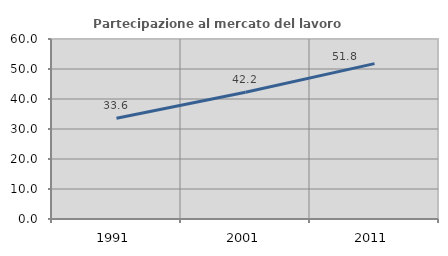
| Category | Partecipazione al mercato del lavoro  femminile |
|---|---|
| 1991.0 | 33.579 |
| 2001.0 | 42.238 |
| 2011.0 | 51.803 |